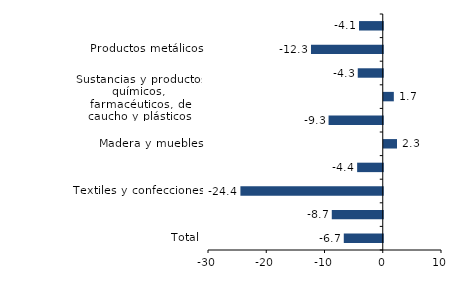
| Category | Series 0 |
|---|---|
| Total | -6.689 |
| Alimentos y bebidas | -8.749 |
| Textiles y confecciones | -24.436 |
| Curtido de cuero y calzado | -4.397 |
| Madera y muebles | 2.274 |
| Papel e imprentas | -9.302 |
| Sustancias y productos químicos, farmacéuticos, de caucho y plásticos | 1.731 |
| Minerales no metálicos | -4.291 |
| Productos metálicos | -12.32 |
| Resto de industria | -4.076 |